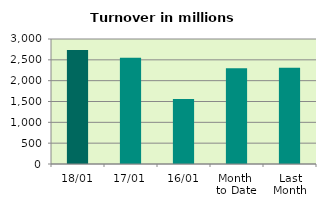
| Category | Series 0 |
|---|---|
| 18/01 | 2733.675 |
| 17/01 | 2547.787 |
| 16/01 | 1558.77 |
| Month 
to Date | 2297.283 |
| Last
Month | 2310.602 |